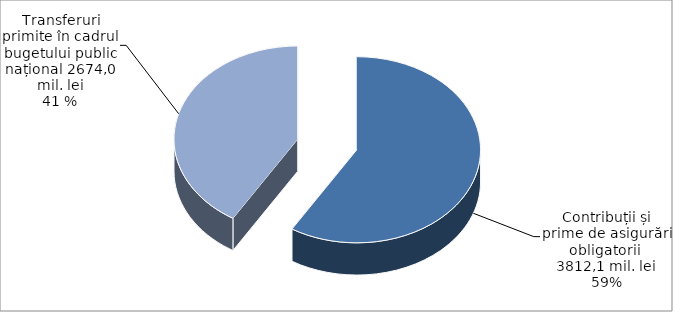
| Category | Series 0 |
|---|---|
| Contibutii | 3812.1 |
| Transferuri | 2674 |